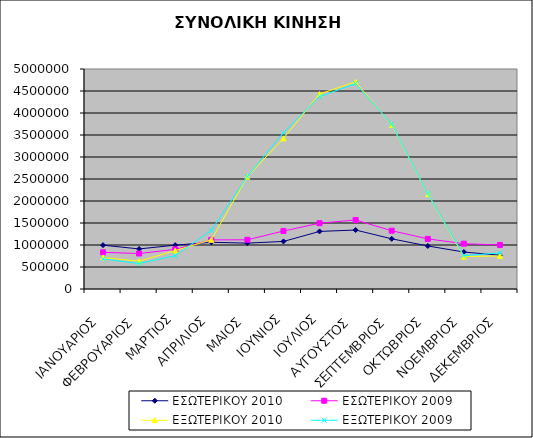
| Category | ΕΣΩΤΕΡΙΚΟΥ 2010 | ΕΣΩΤΕΡΙΚΟΥ 2009 | ΕΞΩΤΕΡΙΚΟΥ 2010 | ΕΞΩΤΕΡΙΚΟΥ 2009 |
|---|---|---|---|---|
| ΙΑΝΟΥΑΡΙΟΣ | 995741 | 833243 | 715921 | 683055 |
| ΦΕΒΡΟΥΑΡΙΟΣ | 910795 | 806287 | 629896 | 579270 |
| ΜΑΡΤΙΟΣ | 995814 | 901541 | 873552 | 756724 |
| ΑΠΡΙΛΙΟΣ | 1061434 | 1116151 | 1118941 | 1331651 |
| ΜΑΙΟΣ | 1042777 | 1118089 | 2552050 | 2558299 |
| ΙΟΥΝΙΟΣ | 1080929 | 1317510 | 3422267 | 3552150 |
| ΙΟΥΛΙΟΣ | 1308520 | 1495105 | 4432001 | 4371016 |
| ΑΥΓΟΥΣΤΟΣ | 1340207 | 1568300 | 4708164 | 4669316 |
| ΣΕΠΤΕΜΒΡΙΟΣ | 1140560 | 1324976 | 3730670 | 3747126 |
| ΟΚΤΩΒΡΙΟΣ | 977863 | 1138507 | 2160969 | 2170063 |
| ΝΟΕΜΒΡΙΟΣ | 840411 | 1029605 | 735388 | 758281 |
| ΔΕΚΕΜΒΡΙΟΣ | 767141 | 1000274 | 751888 | 820468 |